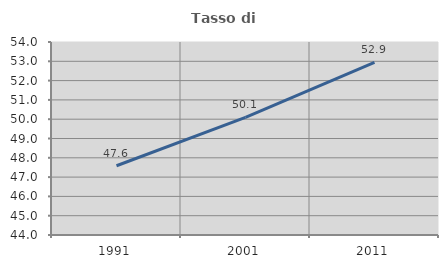
| Category | Tasso di occupazione   |
|---|---|
| 1991.0 | 47.589 |
| 2001.0 | 50.098 |
| 2011.0 | 52.939 |